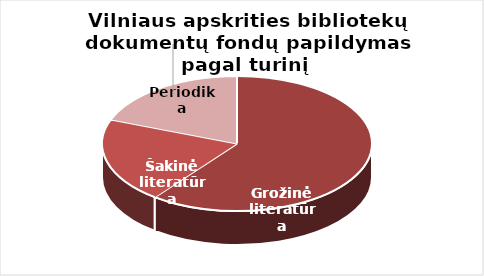
| Category | Series 0 |
|---|---|
| Grožinė literatūra | 62832 |
| Šakinė literatūra | 21221 |
| Periodika | 19952 |